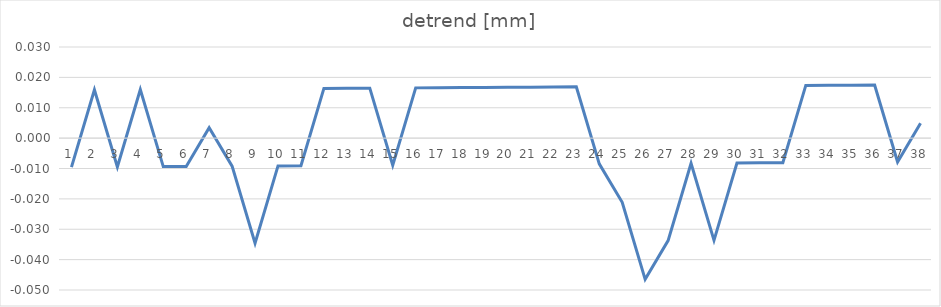
| Category | detrend [mm] |
|---|---|
| 0 | -0.01 |
| 1 | 0.016 |
| 2 | -0.009 |
| 3 | 0.016 |
| 4 | -0.009 |
| 5 | -0.009 |
| 6 | 0.003 |
| 7 | -0.009 |
| 8 | -0.035 |
| 9 | -0.009 |
| 10 | -0.009 |
| 11 | 0.016 |
| 12 | 0.016 |
| 13 | 0.016 |
| 14 | -0.009 |
| 15 | 0.017 |
| 16 | 0.017 |
| 17 | 0.017 |
| 18 | 0.017 |
| 19 | 0.017 |
| 20 | 0.017 |
| 21 | 0.017 |
| 22 | 0.017 |
| 23 | -0.008 |
| 24 | -0.021 |
| 25 | -0.046 |
| 26 | -0.034 |
| 27 | -0.008 |
| 28 | -0.034 |
| 29 | -0.008 |
| 30 | -0.008 |
| 31 | -0.008 |
| 32 | 0.017 |
| 33 | 0.017 |
| 34 | 0.017 |
| 35 | 0.017 |
| 36 | -0.008 |
| 37 | 0.005 |